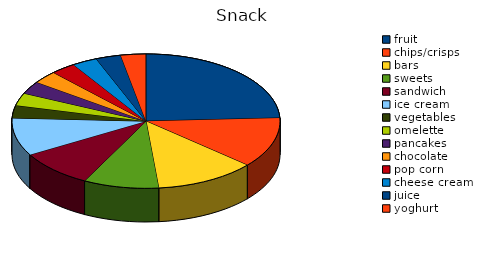
| Category | Series 0 |
|---|---|
| fruit | 8 |
| chips/crisps | 4 |
| bars | 4 |
| sweets | 3 |
| sandwich | 3 |
| ice cream | 3 |
| vegetables | 1 |
| omelette | 1 |
| pancakes | 1 |
| chocolate | 1 |
| pop corn | 1 |
| cheese cream | 1 |
| juice | 1 |
| yoghurt | 1 |